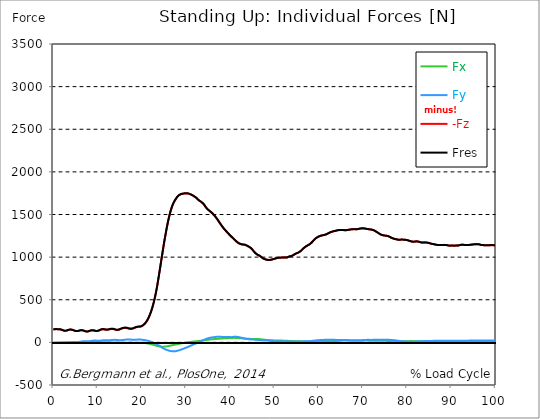
| Category |  Fx |  Fy |  -Fz |  Fres |
|---|---|---|---|---|
| 0.0 | -1.14 | -7.75 | 151.53 | 151.81 |
| 0.167348456675344 | -1.22 | -7.31 | 152.63 | 152.87 |
| 0.334696913350688 | -1.54 | -6.94 | 154.61 | 154.83 |
| 0.5020453700260321 | -1.83 | -6.47 | 156.13 | 156.32 |
| 0.669393826701376 | -2 | -5.71 | 156.21 | 156.37 |
| 0.83674228337672 | -1.78 | -5.68 | 154.5 | 154.66 |
| 1.0040907400520642 | -1.65 | -5.7 | 153.33 | 153.48 |
| 1.1621420602454444 | -1.95 | -5.07 | 154.49 | 154.63 |
| 1.3294905169207885 | -2.13 | -4.37 | 154.83 | 154.95 |
| 1.4968389735961325 | -2.11 | -3.64 | 153.77 | 153.88 |
| 1.6641874302714765 | -1.92 | -3.08 | 151.73 | 151.82 |
| 1.8315358869468206 | -1.57 | -2.78 | 149.12 | 149.2 |
| 1.9988843436221646 | -1.07 | -2.37 | 145.46 | 145.53 |
| 2.1662328002975086 | -0.43 | -2.55 | 141.72 | 141.79 |
| 2.333581256972853 | 0.19 | -3.08 | 138.63 | 138.71 |
| 2.5009297136481967 | 0.67 | -3.88 | 136.62 | 136.73 |
| 2.6682781703235405 | 0.94 | -4.36 | 136.14 | 136.27 |
| 2.8356266269988843 | 1.17 | -4.71 | 136.98 | 137.12 |
| 3.002975083674229 | 1.22 | -4.54 | 138.75 | 138.9 |
| 3.1703235403495724 | 1.17 | -4.05 | 141.62 | 141.76 |
| 3.337671997024917 | 0.83 | -2.95 | 145.07 | 145.18 |
| 3.4957233172182973 | 0.46 | -1.75 | 148.06 | 148.14 |
| 3.663071773893641 | 0.23 | -0.19 | 149.6 | 149.68 |
| 3.8304202305689854 | 0.06 | 1.4 | 150.57 | 150.65 |
| 3.997768687244329 | 0.04 | 2.78 | 150.06 | 150.17 |
| 4.165117143919673 | 0.12 | 3.81 | 148.63 | 148.76 |
| 4.332465600595017 | 0.27 | 4.87 | 146.4 | 146.57 |
| 4.499814057270361 | 0.52 | 5.48 | 143.4 | 143.61 |
| 4.667162513945706 | 0.95 | 5.81 | 139.6 | 139.86 |
| 4.834510970621049 | 1.38 | 5.93 | 136.31 | 136.6 |
| 5.001859427296393 | 1.78 | 5.54 | 133.96 | 134.25 |
| 5.169207883971737 | 2.15 | 5.05 | 132.36 | 132.65 |
| 5.336556340647081 | 2.38 | 4.66 | 132.5 | 132.8 |
| 5.503904797322425 | 2.47 | 4.47 | 133.37 | 133.68 |
| 5.671253253997769 | 2.51 | 4.69 | 135.16 | 135.49 |
| 5.82930457419115 | 2.35 | 5.63 | 137.84 | 138.21 |
| 5.996653030866494 | 2.16 | 7.16 | 140.55 | 141.04 |
| 6.164001487541838 | 1.97 | 8.7 | 141.92 | 142.51 |
| 6.331349944217181 | 1.82 | 10.13 | 142.56 | 143.22 |
| 6.498698400892526 | 1.85 | 11.49 | 141.63 | 142.39 |
| 6.66604685756787 | 1.96 | 12.76 | 140.22 | 141.09 |
| 6.833395314243213 | 2.18 | 13.57 | 137.96 | 138.92 |
| 7.000743770918558 | 2.54 | 14.26 | 134.89 | 135.91 |
| 7.168092227593902 | 2.97 | 14.19 | 131.4 | 132.43 |
| 7.335440684269246 | 3.39 | 14.04 | 128.09 | 129.14 |
| 7.50278914094459 | 3.61 | 13.7 | 127.03 | 128.06 |
| 7.6701375976199335 | 3.71 | 13.26 | 126.9 | 127.9 |
| 7.837486054295278 | 3.78 | 13.41 | 127.96 | 128.93 |
| 7.995537374488658 | 3.77 | 13.37 | 130.35 | 131.31 |
| 8.162885831164003 | 3.63 | 13.85 | 133.72 | 134.72 |
| 8.330234287839346 | 3.41 | 14.97 | 137.41 | 138.51 |
| 8.49758274451469 | 3.24 | 16.28 | 140.32 | 141.56 |
| 8.664931201190035 | 3.26 | 17.68 | 141.13 | 142.55 |
| 8.832279657865378 | 3.29 | 19.04 | 140.98 | 142.58 |
| 8.999628114540721 | 3.39 | 20.19 | 140.15 | 141.93 |
| 9.166976571216066 | 3.51 | 20.99 | 138.54 | 140.46 |
| 9.334325027891412 | 3.7 | 21.41 | 136.23 | 138.23 |
| 9.501673484566755 | 3.85 | 21.23 | 133.74 | 135.75 |
| 9.669021941242098 | 3.92 | 20.87 | 132.61 | 134.58 |
| 9.836370397917442 | 3.97 | 20.28 | 132.21 | 134.11 |
| 10.003718854592787 | 3.92 | 19.95 | 133.25 | 135.1 |
| 10.17106731126813 | 3.74 | 19.68 | 135.6 | 137.39 |
| 10.329118631461512 | 3.54 | 19.74 | 138.95 | 140.76 |
| 10.496467088136853 | 3.3 | 19.92 | 143.29 | 145.09 |
| 10.663815544812199 | 3 | 20.33 | 147.9 | 149.75 |
| 10.831164001487544 | 2.77 | 21.32 | 151.04 | 152.98 |
| 10.998512458162887 | 2.6 | 22.55 | 152.89 | 154.98 |
| 11.16586091483823 | 2.56 | 23.86 | 153.58 | 155.86 |
| 11.333209371513574 | 2.57 | 24.95 | 153.32 | 155.76 |
| 11.50055782818892 | 2.59 | 25.72 | 152.32 | 154.91 |
| 11.667906284864264 | 2.63 | 26 | 150.35 | 153.03 |
| 11.835254741539607 | 2.57 | 25.86 | 148.42 | 151.11 |
| 12.00260319821495 | 2.41 | 25.46 | 147.12 | 149.76 |
| 12.169951654890292 | 2.13 | 24.75 | 147.2 | 149.68 |
| 12.337300111565641 | 1.77 | 24.3 | 148.19 | 150.55 |
| 12.504648568240984 | 1.33 | 24.19 | 150.14 | 152.42 |
| 12.662699888434362 | 0.86 | 24.39 | 153.01 | 155.26 |
| 12.830048345109708 | 0.39 | 25.19 | 155.34 | 157.69 |
| 12.997396801785053 | -0.06 | 26.12 | 157.23 | 159.71 |
| 13.164745258460396 | -0.38 | 27.17 | 158.12 | 160.79 |
| 13.33209371513574 | -0.53 | 28.14 | 157.79 | 160.65 |
| 13.499442171811083 | -0.64 | 28.94 | 156.69 | 159.74 |
| 13.666790628486426 | -0.78 | 29.48 | 154.81 | 158.01 |
| 13.834139085161771 | -0.72 | 29.77 | 151.98 | 155.27 |
| 14.001487541837117 | -0.55 | 29.55 | 148.6 | 151.89 |
| 14.16883599851246 | -0.71 | 28.74 | 146.38 | 149.57 |
| 14.336184455187803 | -1.15 | 28.06 | 145.14 | 148.26 |
| 14.503532911863147 | -1.68 | 27.14 | 145.53 | 148.53 |
| 14.670881368538492 | -2.21 | 26.24 | 146.67 | 149.54 |
| 14.828932688731873 | -2.71 | 25.57 | 148.98 | 151.74 |
| 14.996281145407215 | -3.13 | 25.16 | 152 | 154.68 |
| 15.163629602082558 | -3.39 | 25.29 | 155.72 | 158.41 |
| 15.330978058757903 | -3.81 | 25.83 | 159.74 | 162.49 |
| 15.498326515433247 | -4.11 | 26.61 | 163.03 | 165.85 |
| 15.665674972108594 | -4.32 | 27.52 | 165.87 | 168.79 |
| 15.833023428783937 | -4.36 | 28.71 | 168.26 | 171.36 |
| 16.00037188545928 | -4.41 | 29.83 | 169.63 | 172.87 |
| 16.167720342134626 | -4.33 | 31.03 | 170.01 | 173.47 |
| 16.335068798809967 | -4.19 | 32.05 | 169.75 | 173.39 |
| 16.502417255485312 | -3.94 | 32.99 | 168.71 | 172.54 |
| 16.669765712160658 | -3.68 | 33.78 | 166.87 | 170.89 |
| 16.837114168836 | -3.41 | 34.15 | 164.41 | 168.55 |
| 17.004462625511344 | -3.1 | 34.28 | 161.61 | 165.8 |
| 17.16251394570472 | -2.83 | 34.07 | 158.91 | 163.1 |
| 17.32986240238007 | -2.75 | 33.65 | 157.63 | 161.82 |
| 17.497210859055414 | -2.82 | 32.65 | 156.99 | 161.04 |
| 17.664559315730756 | -3.04 | 31.59 | 157.65 | 161.52 |
| 17.8319077724061 | -3.33 | 30.55 | 159.13 | 162.77 |
| 17.999256229081443 | -3.6 | 29.7 | 161.87 | 165.35 |
| 18.166604685756788 | -3.81 | 29.47 | 165.12 | 168.48 |
| 18.333953142432133 | -3.8 | 30.1 | 169.52 | 172.91 |
| 18.501301599107478 | -3.68 | 31 | 173.65 | 177.12 |
| 18.668650055782823 | -3.51 | 31.82 | 176.32 | 179.91 |
| 18.835998512458165 | -3.48 | 32.11 | 178.86 | 182.53 |
| 19.00334696913351 | -3.42 | 32.53 | 180.73 | 184.5 |
| 19.170695425808855 | -3.21 | 33.13 | 181.73 | 185.6 |
| 19.338043882484197 | -3.07 | 33.08 | 182.27 | 186.11 |
| 19.496095202677576 | -2.94 | 32.96 | 182.78 | 186.57 |
| 19.66344365935292 | -3.29 | 32.89 | 183.56 | 187.31 |
| 19.830792116028263 | -3.74 | 32.3 | 186.07 | 189.67 |
| 19.998140572703612 | -4.24 | 31.18 | 189.83 | 193.21 |
| 20.165489029378953 | -4.86 | 29.96 | 194.75 | 197.86 |
| 20.3328374860543 | -5.46 | 28.82 | 201.16 | 203.99 |
| 20.500185942729644 | -6.27 | 27.58 | 208.97 | 211.61 |
| 20.667534399404985 | -7.21 | 26.23 | 217.37 | 219.83 |
| 20.83488285608033 | -8.19 | 24.68 | 227.38 | 229.65 |
| 21.002231312755672 | -9.36 | 23 | 239.09 | 241.15 |
| 21.16957976943102 | -10.74 | 21.23 | 252.6 | 254.48 |
| 21.336928226106362 | -12.29 | 19.37 | 267.94 | 269.69 |
| 21.504276682781704 | -13.87 | 17.34 | 284.98 | 286.62 |
| 21.67162513945705 | -15.57 | 15.01 | 303.46 | 305.05 |
| 21.82967645965043 | -17.69 | 12.25 | 324.5 | 326.03 |
| 21.997024916325774 | -19.98 | 9.26 | 347.71 | 349.15 |
| 22.16437337300112 | -22.33 | 6.11 | 372.64 | 374.04 |
| 22.33172182967646 | -24.83 | 2.67 | 400.32 | 401.74 |
| 22.499070286351806 | -27.4 | -0.92 | 429.86 | 431.32 |
| 22.666418743027148 | -29.97 | -4.82 | 462.35 | 463.88 |
| 22.833767199702496 | -32.55 | -8.98 | 497.33 | 498.98 |
| 23.00111565637784 | -35.06 | -13.34 | 535.42 | 537.22 |
| 23.168464113053183 | -37.5 | -17.77 | 576.33 | 578.27 |
| 23.335812569728528 | -39.92 | -22.29 | 620.64 | 622.75 |
| 23.50316102640387 | -42.3 | -26.97 | 667.51 | 669.78 |
| 23.670509483079215 | -44.46 | -31.77 | 720.36 | 722.8 |
| 23.83785793975456 | -46.27 | -36.32 | 773.24 | 775.83 |
| 23.995909259947936 | -47.95 | -41.4 | 827.88 | 830.66 |
| 24.163257716623285 | -49.17 | -46.55 | 882.25 | 885.21 |
| 24.330606173298627 | -49.83 | -52.11 | 938.5 | 941.62 |
| 24.49795462997397 | -50.31 | -57.72 | 992.63 | 995.92 |
| 24.665303086649313 | -50.41 | -63.35 | 1046.9 | 1050.35 |
| 24.83265154332466 | -50.31 | -68.2 | 1102.15 | 1105.71 |
| 25.0 | -49.99 | -73.15 | 1156.39 | 1160.07 |
| 25.167348456675345 | -49.3 | -77.54 | 1206.86 | 1210.64 |
| 25.334696913350694 | -48.4 | -81.62 | 1254.84 | 1258.69 |
| 25.502045370026035 | -47.06 | -85.44 | 1302.56 | 1306.47 |
| 25.669393826701377 | -45.77 | -88.92 | 1348.71 | 1352.66 |
| 25.836742283376722 | -44.45 | -92.14 | 1392.54 | 1396.53 |
| 26.004090740052067 | -43.01 | -94.94 | 1432.99 | 1437.01 |
| 26.17143919672741 | -41.34 | -97.34 | 1470.36 | 1474.39 |
| 26.329490516920792 | -39.5 | -99.45 | 1505.24 | 1509.28 |
| 26.49683897359613 | -37.63 | -101.21 | 1537.45 | 1541.49 |
| 26.66418743027148 | -35.74 | -102.36 | 1565.24 | 1569.25 |
| 26.831535886946828 | -33.84 | -103.35 | 1590.89 | 1594.88 |
| 26.998884343622166 | -31.95 | -104.27 | 1614.35 | 1618.31 |
| 27.166232800297514 | -30.15 | -104.67 | 1633.11 | 1637.02 |
| 27.333581256972852 | -28.39 | -104.37 | 1649.65 | 1653.49 |
| 27.5009297136482 | -26.64 | -103.97 | 1665 | 1668.77 |
| 27.668278170323543 | -24.89 | -102.82 | 1678.91 | 1682.55 |
| 27.835626626998888 | -23.25 | -101.32 | 1692.37 | 1695.87 |
| 28.002975083674233 | -21.26 | -99.15 | 1704.28 | 1707.62 |
| 28.170323540349575 | -19.36 | -96.85 | 1714.35 | 1717.54 |
| 28.33767199702492 | -17.55 | -94.5 | 1722.29 | 1725.35 |
| 28.50502045370026 | -15.78 | -92 | 1728.5 | 1731.43 |
| 28.663071773893645 | -13.99 | -88.89 | 1733.44 | 1736.25 |
| 28.830420230568986 | -12.32 | -85.95 | 1736.87 | 1739.53 |
| 28.99776868724433 | -10.73 | -82.78 | 1739.89 | 1742.44 |
| 29.165117143919673 | -9.27 | -79.71 | 1741.8 | 1744.24 |
| 29.33246560059502 | -7.72 | -76.33 | 1743.51 | 1745.85 |
| 29.499814057270367 | -6.26 | -72.71 | 1745.16 | 1747.45 |
| 29.66716251394571 | -4.89 | -69.02 | 1746.46 | 1748.73 |
| 29.834510970621054 | -3.49 | -65.6 | 1747.37 | 1749.6 |
| 30.00185942729639 | -1.93 | -62.03 | 1747.57 | 1749.7 |
| 30.169207883971744 | -0.53 | -58.47 | 1747.47 | 1749.53 |
| 30.33655634064708 | 0.7 | -54.89 | 1746.63 | 1748.66 |
| 30.50390479732243 | 1.74 | -51.6 | 1745.19 | 1747.2 |
| 30.671253253997772 | 2.98 | -47.69 | 1742.96 | 1744.88 |
| 30.829304574191156 | 4.03 | -44.04 | 1740.32 | 1742.17 |
| 30.996653030866494 | 5.46 | -40.23 | 1736.03 | 1737.81 |
| 31.164001487541842 | 6.64 | -36.04 | 1732 | 1733.71 |
| 31.331349944217187 | 7.84 | -32.18 | 1727.72 | 1729.44 |
| 31.498698400892525 | 8.96 | -28.26 | 1723.04 | 1724.78 |
| 31.666046857567874 | 9.94 | -24.69 | 1717.98 | 1719.76 |
| 31.833395314243212 | 10.78 | -21.59 | 1712.67 | 1714.5 |
| 32.00074377091856 | 11.84 | -17.87 | 1706.18 | 1707.95 |
| 32.1680922275939 | 12.86 | -13.38 | 1700.22 | 1701.97 |
| 32.33544068426925 | 13.9 | -9.3 | 1694.66 | 1696.44 |
| 32.50278914094459 | 14.7 | -6.12 | 1686.27 | 1688.04 |
| 32.670137597619934 | 15.4 | -2.26 | 1676.31 | 1678.06 |
| 32.83748605429528 | 16.5 | 2.03 | 1668.11 | 1669.84 |
| 33.004834510970625 | 17.64 | 6.33 | 1661.3 | 1663.03 |
| 33.162885831164004 | 18.6 | 10.2 | 1655.38 | 1657.21 |
| 33.33023428783935 | 19.41 | 13.9 | 1650.6 | 1652.57 |
| 33.497582744514695 | 20.27 | 17.54 | 1644.8 | 1646.86 |
| 33.664931201190036 | 21.19 | 21.02 | 1636.87 | 1639 |
| 33.83227965786538 | 22.09 | 24.42 | 1628.64 | 1630.86 |
| 33.99962811454073 | 23.01 | 27.68 | 1619.9 | 1622.21 |
| 34.16697657121607 | 24.46 | 31.18 | 1607.87 | 1610.12 |
| 34.33432502789141 | 25.99 | 34.91 | 1594.84 | 1596.99 |
| 34.50167348456676 | 27.57 | 38.75 | 1582.48 | 1584.52 |
| 34.6690219412421 | 29.04 | 42.79 | 1570.95 | 1572.91 |
| 34.83637039791744 | 30.23 | 46.53 | 1561.75 | 1563.71 |
| 35.00371885459279 | 31.02 | 48.84 | 1554.8 | 1556.87 |
| 35.17106731126814 | 31.92 | 50.62 | 1547.71 | 1549.9 |
| 35.338415767943474 | 33.23 | 53.23 | 1539.59 | 1541.83 |
| 35.49646708813686 | 34.25 | 54.68 | 1533.13 | 1535.43 |
| 35.6638155448122 | 35 | 55.84 | 1526.94 | 1529.27 |
| 35.831164001487544 | 35.66 | 57.39 | 1518.73 | 1521.1 |
| 35.998512458162885 | 36.33 | 58.95 | 1510.51 | 1512.93 |
| 36.165860914838234 | 37.08 | 59.77 | 1501.04 | 1503.54 |
| 36.333209371513576 | 37.87 | 60.74 | 1491.2 | 1493.76 |
| 36.50055782818892 | 38.67 | 62.25 | 1480.91 | 1483.52 |
| 36.667906284864266 | 39.46 | 63.36 | 1470.4 | 1473.06 |
| 36.83525474153961 | 40.25 | 64.5 | 1459.55 | 1462.27 |
| 37.002603198214956 | 40.9 | 65.5 | 1448.13 | 1450.92 |
| 37.1699516548903 | 41.38 | 65.58 | 1435.2 | 1438.04 |
| 37.337300111565646 | 41.93 | 65.6 | 1421.77 | 1424.65 |
| 37.50464856824098 | 42.67 | 65.49 | 1408.68 | 1411.61 |
| 37.66269988843437 | 43.62 | 65.25 | 1395.94 | 1398.91 |
| 37.83004834510971 | 44.51 | 65 | 1383.46 | 1386.49 |
| 37.99739680178505 | 45.25 | 64.68 | 1371.65 | 1374.73 |
| 38.16474525846039 | 46.15 | 64.33 | 1359.05 | 1362.19 |
| 38.33209371513574 | 46.63 | 64.02 | 1347.27 | 1350.41 |
| 38.49944217181109 | 47.12 | 64.07 | 1335.99 | 1339.15 |
| 38.666790628486424 | 47.62 | 64.29 | 1325.67 | 1328.83 |
| 38.83413908516178 | 48.06 | 64.48 | 1315.98 | 1319.17 |
| 39.001487541837115 | 48.56 | 64.25 | 1306.68 | 1309.89 |
| 39.16883599851246 | 49.15 | 63.49 | 1297.46 | 1300.68 |
| 39.336184455187805 | 49.53 | 62.48 | 1288.32 | 1291.55 |
| 39.503532911863154 | 50.34 | 61.99 | 1278.91 | 1282.19 |
| 39.670881368538495 | 50.98 | 61.87 | 1269.31 | 1272.63 |
| 39.83822982521384 | 51.28 | 61.87 | 1259.81 | 1263.13 |
| 39.996281145407224 | 51.46 | 61.85 | 1250.92 | 1254.23 |
| 40.163629602082565 | 51.47 | 61.59 | 1242.65 | 1245.94 |
| 40.33097805875791 | 51.43 | 61.25 | 1234.6 | 1237.87 |
| 40.498326515433256 | 51.69 | 62.11 | 1226.28 | 1229.56 |
| 40.6656749721086 | 52.63 | 64.67 | 1218.26 | 1221.61 |
| 40.83302342878393 | 52.95 | 66.16 | 1210.63 | 1214.04 |
| 41.00037188545929 | 52.97 | 66.5 | 1200.96 | 1204.42 |
| 41.16772034213463 | 52.65 | 66.16 | 1192.12 | 1195.61 |
| 41.33506879880997 | 52.09 | 65.68 | 1184.28 | 1187.76 |
| 41.50241725548531 | 51.59 | 65.24 | 1176.41 | 1179.88 |
| 41.66976571216066 | 50.62 | 63.97 | 1169.92 | 1173.34 |
| 41.837114168836 | 50.11 | 62.71 | 1163.72 | 1167.08 |
| 42.004462625511344 | 49.6 | 61.06 | 1159.27 | 1162.58 |
| 42.17181108218669 | 48.89 | 59.02 | 1155.38 | 1158.62 |
| 42.32986240238007 | 48.15 | 56.76 | 1152.22 | 1155.38 |
| 42.497210859055414 | 47.82 | 55.3 | 1148.22 | 1151.31 |
| 42.66455931573076 | 47.18 | 52.95 | 1147.27 | 1150.22 |
| 42.831907772406105 | 46.51 | 50.42 | 1146.57 | 1149.39 |
| 42.999256229081446 | 45.84 | 47.93 | 1145.84 | 1148.52 |
| 43.16660468575679 | 45 | 45.86 | 1144.73 | 1147.31 |
| 43.33395314243214 | 44.17 | 43.79 | 1143.62 | 1146.1 |
| 43.50130159910748 | 43.88 | 42.48 | 1139.93 | 1142.36 |
| 43.66865005578282 | 43.68 | 41.29 | 1135.84 | 1138.24 |
| 43.83599851245817 | 43.58 | 39.95 | 1131.37 | 1133.73 |
| 44.00334696913351 | 43.49 | 38.59 | 1126.84 | 1129.16 |
| 44.17069542580886 | 42.73 | 37.42 | 1122.35 | 1124.62 |
| 44.3380438824842 | 41.87 | 36.47 | 1117.43 | 1119.66 |
| 44.49609520267758 | 41.13 | 35.67 | 1111.52 | 1113.73 |
| 44.66344365935292 | 40.45 | 34.96 | 1104.9 | 1107.09 |
| 44.83079211602827 | 39.91 | 34.41 | 1096.91 | 1099.08 |
| 44.99814057270361 | 39.67 | 33.99 | 1087.49 | 1089.69 |
| 45.16548902937895 | 40 | 33.53 | 1077.18 | 1079.42 |
| 45.332837486054295 | 40.52 | 32.7 | 1064.99 | 1067.24 |
| 45.500185942729644 | 40.89 | 31.91 | 1054.89 | 1057.14 |
| 45.66753439940499 | 40.78 | 31.17 | 1046.19 | 1048.41 |
| 45.83488285608033 | 40.21 | 30.39 | 1038.51 | 1040.66 |
| 46.00223131275568 | 39.6 | 30.23 | 1032.05 | 1034.16 |
| 46.16957976943102 | 38.95 | 29.77 | 1026.42 | 1028.46 |
| 46.336928226106366 | 38.59 | 28.41 | 1022.64 | 1024.56 |
| 46.50427668278171 | 38.03 | 26.23 | 1018.87 | 1020.61 |
| 46.671625139457056 | 37.51 | 24.43 | 1014.19 | 1015.8 |
| 46.829676459650436 | 36.76 | 23.42 | 1008.55 | 1010.05 |
| 46.99702491632577 | 35.65 | 23.9 | 1001.02 | 1002.44 |
| 47.16437337300112 | 34.58 | 25.17 | 992.77 | 994.12 |
| 47.33172182967646 | 33.55 | 25.07 | 987.07 | 988.36 |
| 47.49907028635181 | 32.54 | 24.81 | 982.42 | 983.66 |
| 47.66641874302716 | 31.54 | 24.47 | 978.6 | 979.8 |
| 47.83376719970249 | 30.61 | 23.85 | 974.98 | 976.13 |
| 48.001115656377834 | 29.66 | 23.18 | 971.72 | 972.82 |
| 48.16846411305319 | 28.62 | 22.31 | 969.68 | 970.72 |
| 48.33581256972853 | 27.73 | 22.12 | 968.16 | 969.16 |
| 48.50316102640387 | 27.09 | 21 | 967.18 | 968.12 |
| 48.67050948307921 | 26.52 | 19.91 | 966.58 | 967.48 |
| 48.837857939754564 | 26.08 | 18.87 | 966.57 | 967.44 |
| 49.005206396429905 | 25.61 | 17.92 | 966.92 | 967.77 |
| 49.163257716623285 | 25.05 | 17.27 | 968.35 | 969.17 |
| 49.33060617329863 | 24.44 | 16.64 | 970.41 | 971.2 |
| 49.49795462997397 | 23.96 | 15.92 | 973.01 | 973.76 |
| 49.66530308664932 | 23.68 | 15.12 | 975.36 | 976.1 |
| 49.832651543324666 | 23.02 | 14.55 | 976.97 | 977.68 |
| 50.0 | 22.91 | 14.36 | 979.83 | 980.53 |
| 50.16734845667534 | 22.49 | 13.92 | 982.55 | 983.24 |
| 50.33469691335069 | 22.47 | 13.78 | 985.56 | 986.27 |
| 50.50204537002604 | 22.5 | 13.59 | 988.13 | 988.83 |
| 50.66939382670139 | 22.32 | 13.13 | 989.59 | 990.29 |
| 50.836742283376715 | 21.92 | 12.64 | 991.15 | 991.85 |
| 51.00409074005207 | 21.57 | 12.35 | 993.48 | 994.18 |
| 51.17143919672741 | 21.25 | 12.08 | 993.38 | 994.08 |
| 51.32949051692079 | 20.74 | 12.2 | 993.19 | 993.88 |
| 51.496838973596134 | 20.71 | 12.1 | 994.97 | 995.65 |
| 51.66418743027148 | 21.01 | 12.09 | 996.27 | 996.95 |
| 51.831535886946824 | 20.56 | 12.16 | 997.03 | 997.7 |
| 51.99888434362217 | 20.28 | 12.38 | 996.08 | 996.73 |
| 52.16623280029752 | 19.96 | 12.62 | 995.09 | 995.7 |
| 52.33358125697285 | 19.63 | 12.95 | 994.55 | 995.14 |
| 52.5009297136482 | 19.3 | 13.33 | 994.27 | 994.81 |
| 52.668278170323546 | 19.03 | 12.96 | 994.23 | 994.73 |
| 52.835626626998895 | 18.56 | 12.15 | 995.84 | 996.31 |
| 53.00297508367424 | 17.88 | 11.71 | 999.22 | 999.67 |
| 53.17032354034958 | 17.31 | 11.74 | 1003.28 | 1003.7 |
| 53.33767199702492 | 17.24 | 12.24 | 1007.04 | 1007.44 |
| 53.50502045370027 | 17.09 | 11.79 | 1009.47 | 1009.85 |
| 53.663071773893655 | 16.77 | 11.22 | 1011.05 | 1011.41 |
| 53.83042023056899 | 16.39 | 10.85 | 1013.07 | 1013.42 |
| 53.99776868724433 | 15.79 | 10.74 | 1016.38 | 1016.72 |
| 54.16511714391967 | 15.07 | 10.67 | 1020.8 | 1021.14 |
| 54.33246560059503 | 14.42 | 10.94 | 1026.29 | 1026.62 |
| 54.49981405727037 | 13.92 | 11.18 | 1032.46 | 1032.78 |
| 54.667162513945705 | 13.77 | 10.97 | 1036.82 | 1037.15 |
| 54.834510970621054 | 13.46 | 10.48 | 1040.65 | 1040.98 |
| 55.0018594272964 | 13.14 | 10.26 | 1045.24 | 1045.57 |
| 55.169207883971744 | 13.13 | 10.22 | 1049.21 | 1049.54 |
| 55.336556340647086 | 13.61 | 10.36 | 1051.82 | 1052.16 |
| 55.50390479732243 | 13.54 | 10.38 | 1056.17 | 1056.5 |
| 55.671253253997776 | 13.26 | 10.63 | 1061.83 | 1062.17 |
| 55.83860171067312 | 12.44 | 10.69 | 1068.49 | 1068.81 |
| 55.9966530308665 | 11.55 | 10.66 | 1075.01 | 1075.33 |
| 56.16400148754184 | 11 | 10.88 | 1083.44 | 1083.76 |
| 56.33134994421718 | 11 | 11.33 | 1091.96 | 1092.29 |
| 56.498698400892536 | 11.08 | 11.97 | 1100.31 | 1100.65 |
| 56.66604685756788 | 10.98 | 12.54 | 1108.33 | 1108.68 |
| 56.83339531424321 | 10.66 | 12.66 | 1115.24 | 1115.6 |
| 57.00074377091856 | 10.56 | 12.79 | 1121.43 | 1121.8 |
| 57.16809222759391 | 10.26 | 12.84 | 1127.29 | 1127.65 |
| 57.33544068426925 | 10 | 13.13 | 1132.94 | 1133.3 |
| 57.5027891409446 | 9.77 | 13.56 | 1138.46 | 1138.82 |
| 57.670137597619934 | 10.15 | 14.04 | 1142.52 | 1142.89 |
| 57.83748605429528 | 10.1 | 14.37 | 1146.81 | 1147.18 |
| 58.004834510970625 | 9.71 | 14.6 | 1152.45 | 1152.84 |
| 58.16288583116401 | 9.54 | 15.01 | 1159.21 | 1159.62 |
| 58.330234287839346 | 9.36 | 15.92 | 1168.04 | 1168.47 |
| 58.497582744514695 | 9.9 | 17.26 | 1176.86 | 1177.35 |
| 58.66493120119004 | 10.61 | 18.71 | 1185.68 | 1186.24 |
| 58.832279657865385 | 10.82 | 19.79 | 1195.14 | 1195.74 |
| 58.999628114540734 | 10.81 | 20.72 | 1204.84 | 1205.47 |
| 59.16697657121607 | 11.21 | 21.99 | 1212.69 | 1213.37 |
| 59.33432502789142 | 11.44 | 23.04 | 1220.66 | 1221.39 |
| 59.50167348456676 | 11.73 | 23.7 | 1226.57 | 1227.32 |
| 59.66902194124211 | 12.12 | 24.25 | 1232.05 | 1232.85 |
| 59.83637039791745 | 12.61 | 24.94 | 1236.96 | 1237.79 |
| 60.00371885459278 | 13.1 | 25.63 | 1241.45 | 1242.31 |
| 60.17106731126813 | 13.65 | 26.25 | 1245.38 | 1246.27 |
| 60.33841576794349 | 14.25 | 26.84 | 1248.36 | 1249.28 |
| 60.49646708813685 | 14.76 | 27.47 | 1251.13 | 1252.09 |
| 60.6638155448122 | 15.23 | 27.83 | 1253.32 | 1254.3 |
| 60.831164001487544 | 15.36 | 27.88 | 1255.22 | 1256.21 |
| 60.99851245816289 | 15.75 | 28.36 | 1257.07 | 1258.07 |
| 61.16586091483824 | 16.37 | 29.45 | 1258.64 | 1259.68 |
| 61.333209371513576 | 16.83 | 30.47 | 1260.3 | 1261.37 |
| 61.50055782818892 | 16.58 | 31.05 | 1262.68 | 1263.76 |
| 61.667906284864266 | 16.01 | 31.46 | 1266.11 | 1267.19 |
| 61.835254741539615 | 15.62 | 31.52 | 1269.81 | 1270.89 |
| 62.002603198214956 | 15.2 | 31.51 | 1274.49 | 1275.58 |
| 62.16995165489029 | 15.11 | 31.38 | 1279.37 | 1280.47 |
| 62.33730011156564 | 15.16 | 31.35 | 1283.59 | 1284.7 |
| 62.504648568240995 | 15.22 | 31.44 | 1287.3 | 1288.43 |
| 62.67199702491633 | 15.64 | 30.99 | 1291.53 | 1292.69 |
| 62.83004834510971 | 16.13 | 30.85 | 1294.87 | 1296.04 |
| 62.99739680178505 | 16.59 | 30.81 | 1297.72 | 1298.91 |
| 63.1647452584604 | 17.04 | 30.72 | 1300.46 | 1301.65 |
| 63.33209371513575 | 17.51 | 30.86 | 1302.69 | 1303.89 |
| 63.4994421718111 | 17.65 | 30.47 | 1304.32 | 1305.5 |
| 63.666790628486424 | 17.25 | 29.65 | 1306.3 | 1307.42 |
| 63.83413908516177 | 16.85 | 28.7 | 1308.64 | 1309.7 |
| 64.00148754183712 | 16.57 | 27.79 | 1311.14 | 1312.14 |
| 64.16883599851248 | 16.63 | 27.26 | 1313.53 | 1314.5 |
| 64.3361844551878 | 17.19 | 27.41 | 1315.24 | 1316.22 |
| 64.50353291186315 | 17.74 | 27.61 | 1316.22 | 1317.21 |
| 64.6708813685385 | 18.38 | 27.8 | 1316.77 | 1317.78 |
| 64.83822982521384 | 19.07 | 27.99 | 1317.22 | 1318.25 |
| 65.00557828188919 | 19.83 | 28.3 | 1317.41 | 1318.47 |
| 65.16362960208257 | 20.6 | 28.62 | 1317.55 | 1318.64 |
| 65.3309780587579 | 21.49 | 28.81 | 1317.43 | 1318.54 |
| 65.49832651543326 | 22.06 | 28.88 | 1317.05 | 1318.18 |
| 65.6656749721086 | 22.4 | 28.85 | 1316.36 | 1317.5 |
| 65.83302342878395 | 22.68 | 28.66 | 1315.67 | 1316.81 |
| 66.00037188545929 | 22.96 | 28.48 | 1314.99 | 1316.13 |
| 66.16772034213463 | 22.71 | 28.12 | 1315.09 | 1316.22 |
| 66.33506879880998 | 22.5 | 27.63 | 1315.95 | 1317.07 |
| 66.50241725548531 | 22.16 | 27.01 | 1317.24 | 1318.32 |
| 66.66976571216065 | 21.76 | 26.4 | 1318.86 | 1319.92 |
| 66.83711416883601 | 21.05 | 25.55 | 1320.51 | 1321.53 |
| 67.00446262551135 | 20.5 | 24.91 | 1322.19 | 1323.17 |
| 67.1718110821867 | 20.16 | 24.57 | 1323.89 | 1324.87 |
| 67.32986240238007 | 19.74 | 24.34 | 1325.03 | 1325.99 |
| 67.49721085905541 | 19.25 | 24.31 | 1326.15 | 1327.11 |
| 67.66455931573076 | 18.79 | 24.31 | 1327.19 | 1328.15 |
| 67.83190777240611 | 18.55 | 24.45 | 1327.65 | 1328.62 |
| 67.99925622908145 | 18.5 | 24.6 | 1327.67 | 1328.64 |
| 68.16660468575678 | 18.57 | 24.77 | 1327.36 | 1328.35 |
| 68.33395314243214 | 18.64 | 24.95 | 1327.05 | 1328.04 |
| 68.50130159910749 | 18.71 | 25.13 | 1326.73 | 1327.74 |
| 68.66865005578282 | 18.72 | 25.3 | 1327.25 | 1328.26 |
| 68.83599851245816 | 18.6 | 25.29 | 1328.26 | 1329.25 |
| 69.00334696913352 | 18.29 | 25.17 | 1329.76 | 1330.74 |
| 69.17069542580886 | 17.97 | 25.19 | 1331.98 | 1332.95 |
| 69.3380438824842 | 17.76 | 25.24 | 1334.65 | 1335.63 |
| 69.50539233915956 | 18.19 | 25.47 | 1335.73 | 1336.73 |
| 69.66344365935292 | 18.73 | 25.82 | 1336.34 | 1337.35 |
| 69.83079211602826 | 19.18 | 26.31 | 1336.95 | 1337.97 |
| 69.99814057270362 | 19.63 | 26.94 | 1336.95 | 1337.98 |
| 70.16548902937896 | 20.08 | 27.66 | 1336.53 | 1337.59 |
| 70.33283748605429 | 20.62 | 28.25 | 1335.65 | 1336.73 |
| 70.50018594272964 | 21.29 | 28.66 | 1334.18 | 1335.28 |
| 70.667534399405 | 21.51 | 28.97 | 1332.59 | 1333.7 |
| 70.83488285608033 | 21.45 | 29.22 | 1330.94 | 1332.03 |
| 71.00223131275568 | 21.4 | 29.46 | 1329.29 | 1330.37 |
| 71.16957976943102 | 20.83 | 29.43 | 1328.02 | 1329.06 |
| 71.33692822610637 | 20.25 | 29.39 | 1326.76 | 1327.77 |
| 71.50427668278171 | 19.62 | 29.32 | 1325.54 | 1326.51 |
| 71.67162513945706 | 18.96 | 29.22 | 1324.36 | 1325.3 |
| 71.8389735961324 | 18.29 | 29.12 | 1323.18 | 1324.08 |
| 71.99702491632577 | 17.78 | 29.15 | 1321.76 | 1322.64 |
| 72.16437337300113 | 17.48 | 29.37 | 1320 | 1320.87 |
| 72.33172182967647 | 17.6 | 29.54 | 1316.97 | 1317.84 |
| 72.49907028635181 | 17.93 | 29.89 | 1313.09 | 1313.95 |
| 72.66641874302715 | 18.61 | 30.23 | 1308.85 | 1309.73 |
| 72.8337671997025 | 19.18 | 30.43 | 1303.92 | 1304.82 |
| 73.00111565637783 | 19.69 | 30.73 | 1297.97 | 1298.9 |
| 73.16846411305319 | 20.01 | 30.9 | 1292.31 | 1293.25 |
| 73.33581256972853 | 19.94 | 30.81 | 1287.24 | 1288.18 |
| 73.50316102640387 | 19.72 | 31.23 | 1281.99 | 1282.94 |
| 73.67050948307921 | 19.53 | 31.45 | 1275.83 | 1276.78 |
| 73.83785793975457 | 19.37 | 31.46 | 1269.39 | 1270.33 |
| 74.00520639642991 | 19.19 | 31.43 | 1265.03 | 1265.96 |
| 74.16325771662328 | 19.4 | 31.55 | 1261.42 | 1262.35 |
| 74.33060617329863 | 19.68 | 31.71 | 1258.75 | 1259.68 |
| 74.49795462997398 | 19.65 | 31.73 | 1256.62 | 1257.52 |
| 74.66530308664932 | 19.62 | 31.75 | 1254.48 | 1255.37 |
| 74.83265154332466 | 19.48 | 31.58 | 1252.94 | 1253.81 |
| 75.00000000000001 | 18.78 | 30.83 | 1252.07 | 1252.89 |
| 75.16734845667534 | 17.77 | 30.2 | 1250.8 | 1251.59 |
| 75.3346969133507 | 17.21 | 29.64 | 1249.93 | 1250.68 |
| 75.50204537002605 | 17.04 | 29.56 | 1248.18 | 1248.92 |
| 75.66939382670138 | 17.05 | 29.58 | 1245.91 | 1246.64 |
| 75.83674228337672 | 16.86 | 29.41 | 1243.02 | 1243.73 |
| 76.00409074005208 | 16.84 | 29.49 | 1239.28 | 1239.98 |
| 76.17143919672742 | 16.85 | 29.42 | 1234.81 | 1235.49 |
| 76.33878765340276 | 16.22 | 28.19 | 1229.3 | 1229.93 |
| 76.49683897359614 | 16.15 | 27.53 | 1225.17 | 1225.76 |
| 76.66418743027148 | 16.06 | 27.03 | 1221.71 | 1222.28 |
| 76.83153588694682 | 15.63 | 26.19 | 1218.56 | 1219.1 |
| 76.99888434362218 | 14.9 | 25.63 | 1215.94 | 1216.45 |
| 77.16623280029752 | 14.92 | 25.15 | 1214.07 | 1214.58 |
| 77.33358125697285 | 14.96 | 23.92 | 1211.66 | 1212.14 |
| 77.5009297136482 | 14.71 | 22.16 | 1208.83 | 1209.26 |
| 77.66827817032356 | 14.23 | 21.05 | 1206.9 | 1207.3 |
| 77.83562662699889 | 13.73 | 19.82 | 1205.48 | 1205.85 |
| 78.00297508367423 | 13.05 | 18.93 | 1204.36 | 1204.69 |
| 78.17032354034959 | 12.48 | 17.83 | 1203.46 | 1203.77 |
| 78.33767199702493 | 11.9 | 16.63 | 1203.72 | 1204.01 |
| 78.50502045370027 | 11.65 | 15.49 | 1204.78 | 1205.06 |
| 78.67236891037561 | 11.57 | 14.39 | 1205.62 | 1205.91 |
| 78.83042023056899 | 11.82 | 13.4 | 1205.73 | 1206.02 |
| 78.99776868724433 | 12.22 | 12.86 | 1205.32 | 1205.63 |
| 79.16511714391969 | 12.43 | 11.76 | 1204.91 | 1205.23 |
| 79.33246560059503 | 12.52 | 10.88 | 1204.27 | 1204.6 |
| 79.49981405727036 | 12.46 | 10.28 | 1203.35 | 1203.67 |
| 79.66716251394571 | 12.63 | 9.87 | 1202.21 | 1202.53 |
| 79.83451097062107 | 13.05 | 9.68 | 1200.82 | 1201.14 |
| 80.00185942729641 | 13.29 | 9.31 | 1198.96 | 1199.28 |
| 80.16920788397174 | 13.4 | 8.84 | 1196.85 | 1197.16 |
| 80.33655634064709 | 13.95 | 8.68 | 1194.38 | 1194.7 |
| 80.50390479732243 | 14.67 | 8.88 | 1191.2 | 1191.52 |
| 80.67125325399778 | 14.91 | 8.74 | 1188.15 | 1188.47 |
| 80.83860171067312 | 15.14 | 8.61 | 1185.13 | 1185.45 |
| 80.99665303086651 | 15.26 | 8.74 | 1183.19 | 1183.5 |
| 81.16400148754184 | 14.97 | 8.74 | 1181.75 | 1182.05 |
| 81.3313499442172 | 14.28 | 8.6 | 1180.92 | 1181.2 |
| 81.49869840089255 | 13.67 | 8.56 | 1180.46 | 1180.71 |
| 81.66604685756786 | 13.51 | 9.43 | 1181.77 | 1182 |
| 81.83339531424322 | 12.98 | 10.34 | 1183.75 | 1183.97 |
| 82.00074377091858 | 12.44 | 10.96 | 1184.82 | 1185.04 |
| 82.16809222759392 | 11.95 | 11.47 | 1185.42 | 1185.63 |
| 82.33544068426926 | 12.3 | 11.86 | 1184.27 | 1184.49 |
| 82.50278914094459 | 12.89 | 12.33 | 1182.26 | 1182.48 |
| 82.67013759761994 | 13.38 | 12.83 | 1179.83 | 1180.06 |
| 82.83748605429528 | 14.02 | 13.53 | 1176.88 | 1177.11 |
| 83.00483451097062 | 14.43 | 14.08 | 1174.17 | 1174.41 |
| 83.17218296764597 | 14.16 | 14.24 | 1172.2 | 1172.44 |
| 83.33023428783935 | 13.43 | 14.13 | 1170.8 | 1171.03 |
| 83.4975827445147 | 13.01 | 14.24 | 1170.21 | 1170.43 |
| 83.66493120119004 | 12.77 | 14.39 | 1170.51 | 1170.73 |
| 83.83227965786537 | 12.53 | 14.76 | 1171.77 | 1171.99 |
| 83.99962811454073 | 12.41 | 15.18 | 1172.78 | 1173 |
| 84.16697657121607 | 12.59 | 15.57 | 1172.4 | 1172.63 |
| 84.33432502789142 | 12.93 | 16.05 | 1171.23 | 1171.48 |
| 84.50167348456677 | 12.49 | 16.21 | 1169.86 | 1170.11 |
| 84.6690219412421 | 12.01 | 16.36 | 1168.49 | 1168.73 |
| 84.83637039791745 | 12.21 | 16.95 | 1167.04 | 1167.29 |
| 85.0037188545928 | 12.52 | 17.27 | 1164.75 | 1165.01 |
| 85.17106731126813 | 12.36 | 17.38 | 1161.41 | 1161.68 |
| 85.33841576794349 | 12.21 | 17.44 | 1158.53 | 1158.8 |
| 85.50576422461883 | 11.92 | 17.3 | 1156.56 | 1156.82 |
| 85.66381554481221 | 11.47 | 17.24 | 1154.98 | 1155.24 |
| 85.83116400148755 | 11.23 | 17.54 | 1154.06 | 1154.31 |
| 85.99851245816289 | 11.52 | 18.13 | 1152.24 | 1152.51 |
| 86.16586091483823 | 11.9 | 18.69 | 1150.05 | 1150.34 |
| 86.33320937151358 | 11.84 | 18.89 | 1147.36 | 1147.66 |
| 86.50055782818893 | 11.62 | 19.06 | 1145.2 | 1145.5 |
| 86.66790628486427 | 11.37 | 19.23 | 1143.89 | 1144.18 |
| 86.83525474153961 | 11.31 | 19.32 | 1142.62 | 1142.92 |
| 87.00260319821496 | 11 | 19.38 | 1142 | 1142.3 |
| 87.16995165489031 | 10.92 | 19.45 | 1142.29 | 1142.58 |
| 87.33730011156564 | 11.16 | 19.46 | 1142.2 | 1142.49 |
| 87.504648568241 | 11.3 | 19.39 | 1141.91 | 1142.21 |
| 87.67199702491634 | 11.24 | 19.43 | 1141.98 | 1142.28 |
| 87.83004834510972 | 11.09 | 19.52 | 1142.28 | 1142.58 |
| 87.99739680178506 | 11.04 | 19.86 | 1142.94 | 1143.24 |
| 88.1647452584604 | 11.34 | 20.03 | 1143.27 | 1143.58 |
| 88.33209371513574 | 11.5 | 20.08 | 1143.45 | 1143.76 |
| 88.49944217181108 | 11.61 | 20.01 | 1143.24 | 1143.55 |
| 88.66679062848644 | 11.82 | 20.12 | 1142.75 | 1143.06 |
| 88.83413908516178 | 11.98 | 20.17 | 1141.62 | 1141.94 |
| 89.00148754183712 | 12.78 | 20.26 | 1140.22 | 1140.53 |
| 89.16883599851246 | 13.59 | 20.28 | 1138.02 | 1138.33 |
| 89.33618445518782 | 14.08 | 20.13 | 1135.59 | 1135.91 |
| 89.50353291186315 | 14.12 | 19.95 | 1134.68 | 1135 |
| 89.6708813685385 | 14.13 | 19.8 | 1134.44 | 1134.76 |
| 89.83822982521386 | 14.14 | 19.67 | 1134.67 | 1135 |
| 90.00557828188919 | 14.17 | 19.55 | 1134.95 | 1135.27 |
| 90.16362960208257 | 13.83 | 19.18 | 1134.93 | 1135.24 |
| 90.3309780587579 | 13.59 | 19.06 | 1134.77 | 1135.08 |
| 90.49832651543326 | 13.44 | 19.05 | 1134.56 | 1134.87 |
| 90.66567497210859 | 13.4 | 19.04 | 1134.68 | 1135 |
| 90.83302342878395 | 13.51 | 19.07 | 1134.9 | 1135.22 |
| 91.00037188545929 | 13.72 | 19.17 | 1134.73 | 1135.05 |
| 91.16772034213463 | 13.99 | 19.41 | 1135.12 | 1135.46 |
| 91.33506879880998 | 14.13 | 19.49 | 1135.55 | 1135.89 |
| 91.50241725548533 | 13.77 | 19.3 | 1136.3 | 1136.64 |
| 91.66976571216065 | 13.21 | 19.08 | 1137.71 | 1138.04 |
| 91.83711416883601 | 12.64 | 18.88 | 1140.03 | 1140.36 |
| 92.00446262551137 | 12.26 | 18.75 | 1142.63 | 1142.97 |
| 92.1718110821867 | 12.32 | 18.89 | 1144.29 | 1144.63 |
| 92.33915953886203 | 12.84 | 19.15 | 1144.94 | 1145.29 |
| 92.49721085905541 | 13.54 | 19.36 | 1144.79 | 1145.16 |
| 92.66455931573077 | 13.9 | 19.42 | 1144.2 | 1144.58 |
| 92.83190777240611 | 13.7 | 19.51 | 1143.57 | 1143.94 |
| 92.99925622908145 | 13.52 | 19.61 | 1142.91 | 1143.28 |
| 93.1666046857568 | 13.44 | 19.73 | 1142.17 | 1142.54 |
| 93.33395314243214 | 13.37 | 19.91 | 1141.81 | 1142.19 |
| 93.50130159910749 | 13.33 | 20.16 | 1141.88 | 1142.27 |
| 93.66865005578283 | 13.29 | 20.41 | 1141.96 | 1142.35 |
| 93.83599851245818 | 13.26 | 20.49 | 1142.38 | 1142.77 |
| 94.00334696913353 | 13.23 | 20.56 | 1142.81 | 1143.2 |
| 94.17069542580886 | 13.16 | 20.65 | 1143.66 | 1144.05 |
| 94.3380438824842 | 13.1 | 20.81 | 1144.86 | 1145.26 |
| 94.50539233915954 | 13.1 | 21.04 | 1146.15 | 1146.55 |
| 94.66344365935292 | 13.58 | 21.27 | 1147.43 | 1147.85 |
| 94.83079211602828 | 13.79 | 21.34 | 1148.31 | 1148.73 |
| 94.99814057270362 | 13.65 | 21.11 | 1149.21 | 1149.62 |
| 95.16548902937897 | 13.33 | 21.03 | 1150.61 | 1151.01 |
| 95.33283748605432 | 13.35 | 21.39 | 1151.17 | 1151.58 |
| 95.50018594272963 | 13.39 | 21.56 | 1151.77 | 1152.19 |
| 95.66753439940499 | 13.81 | 21.54 | 1152.13 | 1152.55 |
| 95.83488285608034 | 14.18 | 21.61 | 1152.09 | 1152.52 |
| 96.00223131275567 | 14.61 | 21.88 | 1151.59 | 1152.03 |
| 96.16957976943102 | 15.09 | 21.99 | 1150.45 | 1150.91 |
| 96.33692822610638 | 15.56 | 22.01 | 1148.93 | 1149.39 |
| 96.50427668278171 | 15.49 | 21.8 | 1146.48 | 1146.94 |
| 96.67162513945706 | 15.32 | 21.49 | 1143.18 | 1143.64 |
| 96.8389735961324 | 14.86 | 21.48 | 1142.11 | 1142.56 |
| 96.99702491632577 | 14.82 | 21.67 | 1141.06 | 1141.52 |
| 97.16437337300111 | 14.76 | 21.83 | 1140.53 | 1140.99 |
| 97.33172182967647 | 15.22 | 22.15 | 1140.19 | 1140.67 |
| 97.49907028635181 | 15.14 | 22.1 | 1139.57 | 1140.05 |
| 97.66641874302715 | 14.55 | 21.97 | 1139.02 | 1139.49 |
| 97.8337671997025 | 14.46 | 21.95 | 1139.38 | 1139.85 |
| 98.00111565637785 | 14.28 | 21.86 | 1139.62 | 1140.08 |
| 98.16846411305319 | 14.06 | 22.01 | 1139.65 | 1140.12 |
| 98.33581256972855 | 13.86 | 22.18 | 1139.76 | 1140.23 |
| 98.50316102640389 | 13.74 | 22.23 | 1139.71 | 1140.19 |
| 98.67050948307921 | 13.9 | 22.44 | 1140.06 | 1140.54 |
| 98.83785793975456 | 14.27 | 22.86 | 1140.55 | 1141.04 |
| 99.0052063964299 | 14.36 | 22.98 | 1140.58 | 1141.09 |
| 99.17255485310525 | 14.4 | 23.08 | 1140.52 | 1141.04 |
| 99.33060617329863 | 14.42 | 23.16 | 1140.39 | 1140.91 |
| 99.49795462997399 | 14.57 | 23.16 | 1140.27 | 1140.79 |
| 99.66530308664933 | 14.35 | 22.8 | 1139.88 | 1140.39 |
| 99.83265154332467 | 13.91 | 22.61 | 1139.85 | 1140.35 |
| 100.0 | 13.82 | 22.74 | 1139.85 | 1140.34 |